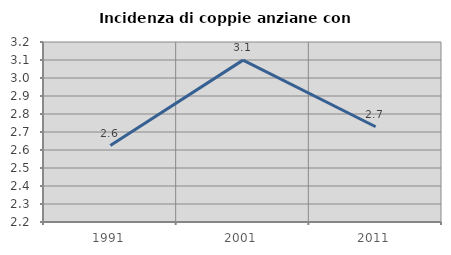
| Category | Incidenza di coppie anziane con figli |
|---|---|
| 1991.0 | 2.625 |
| 2001.0 | 3.099 |
| 2011.0 | 2.729 |